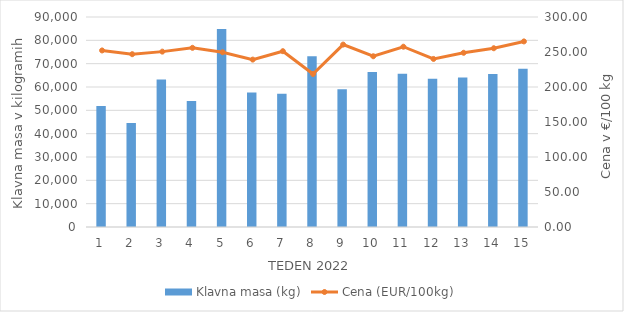
| Category | Klavna masa (kg) |
|---|---|
| 1.0 | 51818 |
| 2.0 | 44619 |
| 3.0 | 63233 |
| 4.0 | 53993 |
| 5.0 | 84871 |
| 6.0 | 57648 |
| 7.0 | 57159 |
| 8.0 | 73139 |
| 9.0 | 59056 |
| 10.0 | 66417 |
| 11.0 | 65723 |
| 12.0 | 63530 |
| 13.0 | 64069 |
| 14.0 | 65564 |
| 15.0 | 67787 |